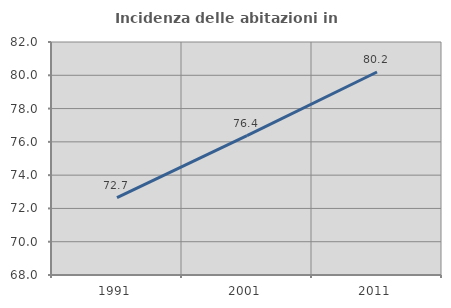
| Category | Incidenza delle abitazioni in proprietà  |
|---|---|
| 1991.0 | 72.654 |
| 2001.0 | 76.379 |
| 2011.0 | 80.198 |